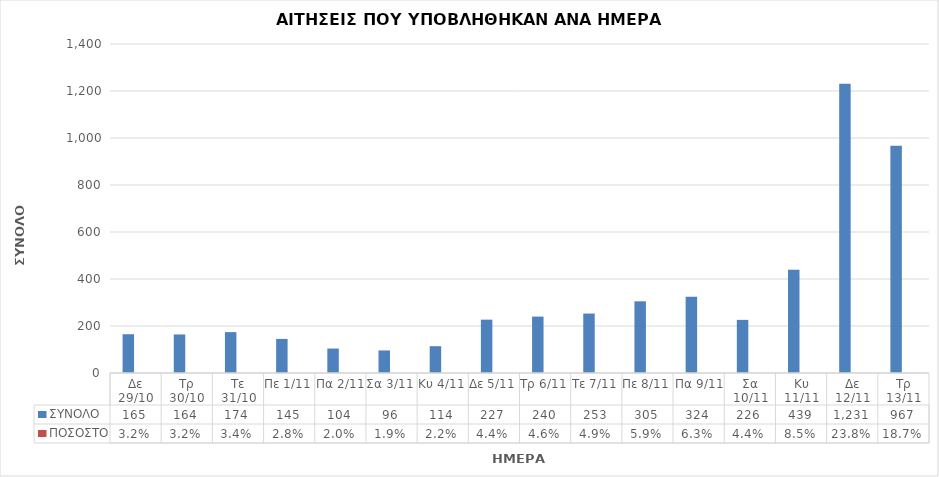
| Category | ΣΥΝΟΛΟ | ΠΟΣΟΣΤΟ |
|---|---|---|
| Δε 29/10 | 165 | 0.032 |
| Τρ 30/10 | 164 | 0.032 |
| Τε 31/10 | 174 | 0.034 |
| Πε 1/11 | 145 | 0.028 |
| Πα 2/11 | 104 | 0.02 |
| Σα 3/11 | 96 | 0.019 |
| Κυ 4/11 | 114 | 0.022 |
| Δε 5/11 | 227 | 0.044 |
| Τρ 6/11 | 240 | 0.046 |
| Τε 7/11 | 253 | 0.049 |
| Πε 8/11 | 305 | 0.059 |
| Πα 9/11 | 324 | 0.063 |
| Σα 10/11 | 226 | 0.044 |
| Κυ 11/11 | 439 | 0.085 |
| Δε 12/11 | 1231 | 0.238 |
| Τρ 13/11 | 967 | 0.187 |